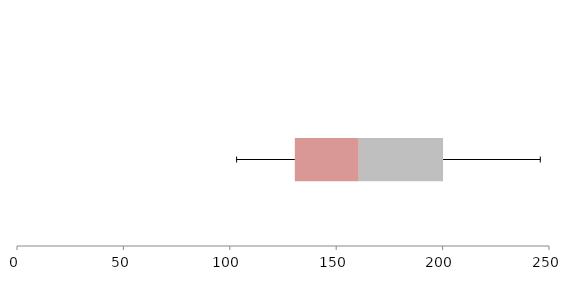
| Category | Series 1 | Series 2 | Series 3 |
|---|---|---|---|
| 0 | 130.549 | 30.061 | 39.6 |